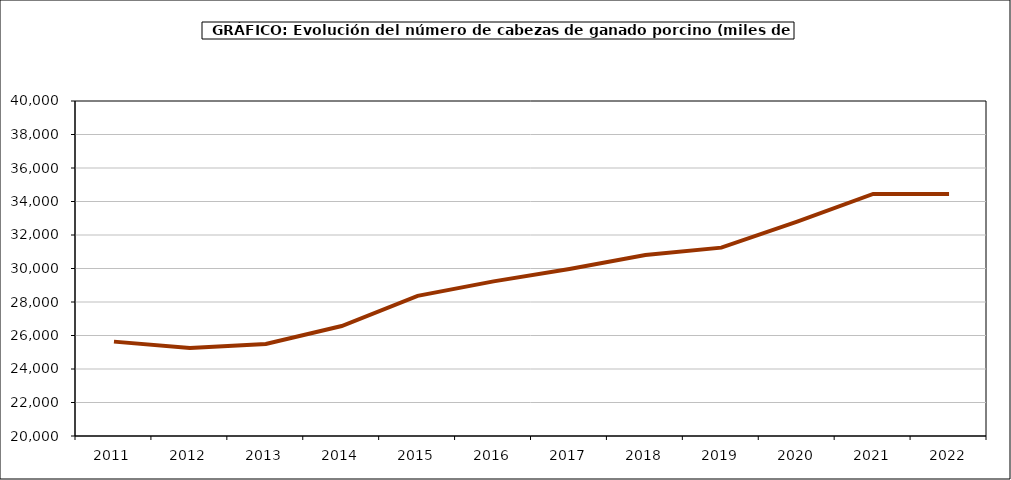
| Category | Total porcino |
|---|---|
| 2011.0 | 25634 |
| 2012.0 | 25250.377 |
| 2013.0 | 25494.715 |
| 2014.0 | 26567.578 |
| 2015.0 | 28367.335 |
| 2016.0 | 29231.595 |
| 2017.0 | 29971.357 |
| 2018.0 | 30804.102 |
| 2019.0 | 31246 |
| 2020.0 | 32795 |
| 2021.0 | 34455 |
| 2022.0 | 34455 |